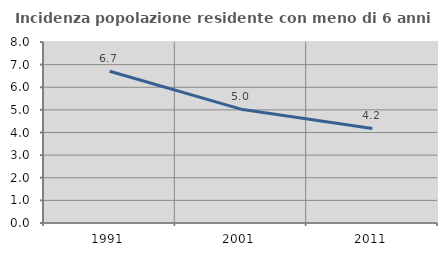
| Category | Incidenza popolazione residente con meno di 6 anni |
|---|---|
| 1991.0 | 6.71 |
| 2001.0 | 5.031 |
| 2011.0 | 4.178 |